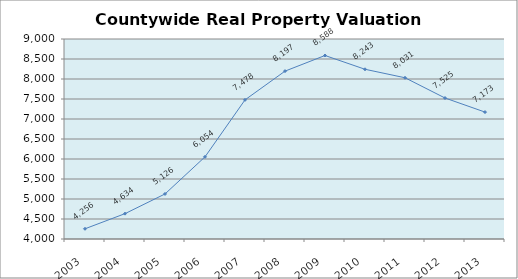
| Category | Valuation ($M) |
|---|---|
| 2003.0 | 4255.534 |
| 2004.0 | 4633.75 |
| 2005.0 | 5125.832 |
| 2006.0 | 6053.546 |
| 2007.0 | 7477.997 |
| 2008.0 | 8196.57 |
| 2009.0 | 8587.835 |
| 2010.0 | 8243.328 |
| 2011.0 | 8031.012 |
| 2012.0 | 7524.783 |
| 2013.0 | 7173.041 |